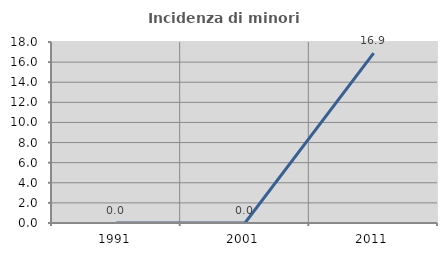
| Category | Incidenza di minori stranieri |
|---|---|
| 1991.0 | 0 |
| 2001.0 | 0 |
| 2011.0 | 16.901 |